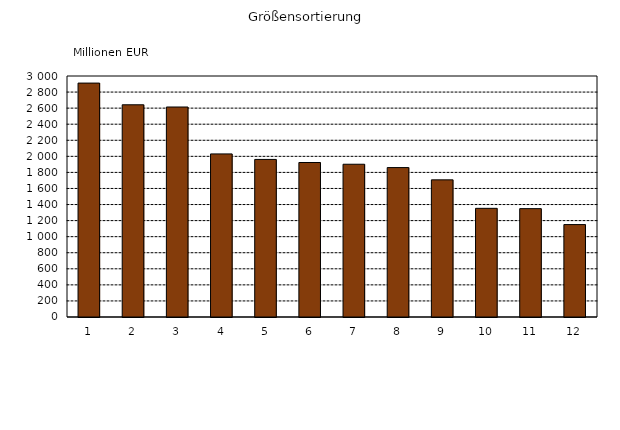
| Category | Series 0 |
|---|---|
| 1 | 2911.824 |
| 2 | 2641.63 |
| 3 | 2613.98 |
| 4 | 2030.044 |
| 5 | 1961.401 |
| 6 | 1923.108 |
| 7 | 1901.607 |
| 8 | 1859.829 |
| 9 | 1707.289 |
| 10 | 1352.704 |
| 11 | 1348.926 |
| 12 | 1150.381 |